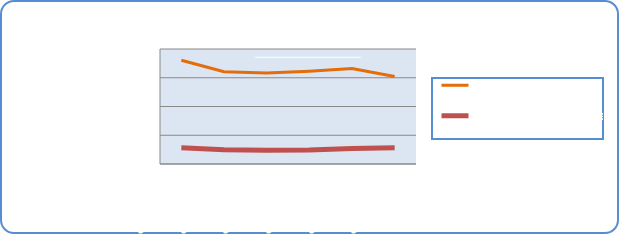
| Category | Motorin Türleri | Benzin Türleri |
|---|---|---|
| 8/19/19 | 72206601.954 | 11354943.226 |
| 8/20/19 | 64247228.341 | 9839402.7 |
| 8/21/19 | 63241667.878 | 9530255.308 |
| 8/22/19 | 64568910.707 | 9790087.023 |
| 8/23/19 | 66425842.249 | 10814714.972 |
| 8/24/19 | 60827997.61 | 11358796.227 |